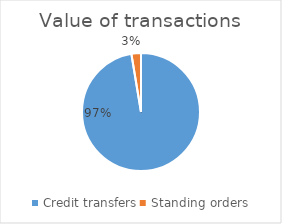
| Category | Value of transactions |
|---|---|
| Credit transfers | 2183503297201 |
| Standing orders | 58545606441 |